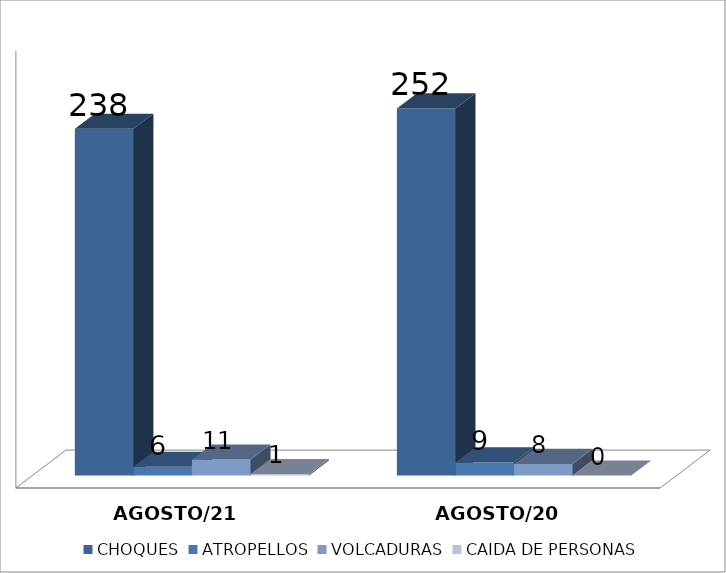
| Category | CHOQUES | ATROPELLOS | VOLCADURAS | CAIDA DE PERSONAS |
|---|---|---|---|---|
| AGOSTO/21 | 238 | 6 | 11 | 1 |
| AGOSTO/20 | 252 | 9 | 8 | 0 |